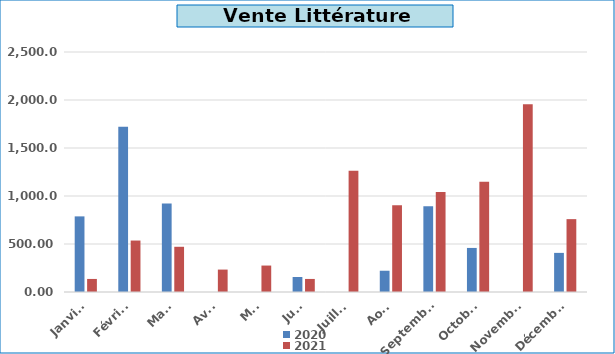
| Category | 2020 | 2021 |
|---|---|---|
| Janvier | 787.7 | 136 |
| Février | 1722.6 | 536 |
| Mars | 923 | 471 |
| Avril | 0 | 233.5 |
| Mai | 0 | 275.5 |
| Juin | 156 | 136 |
| Juillet | 0 | 1262.1 |
| Août | 221.5 | 903 |
| Septembre | 892.8 | 1040.45 |
| Octobre | 459 | 1149 |
| Novembre | 0 | 1956.3 |
| Décembre | 407.5 | 759 |